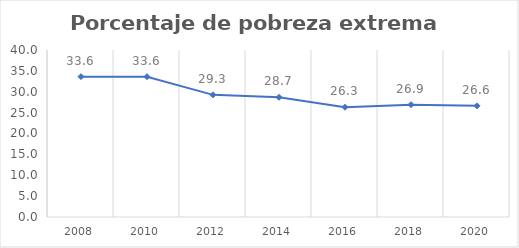
| Category | Series 0 |
|---|---|
| 2008.0 | 33.623 |
| 2010.0 | 33.603 |
| 2012.0 | 29.258 |
| 2014.0 | 28.679 |
| 2016.0 | 26.288 |
| 2018.0 | 26.901 |
| 2020.0 | 26.627 |